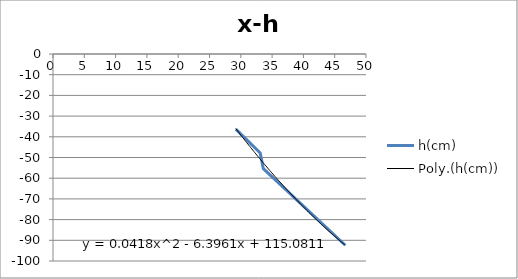
| Category | h(cm) |
|---|---|
| 46.7 | -92.4 |
| 33.6 | -55.4 |
| 33.1 | -47.8 |
| 29.2 | -36.3 |